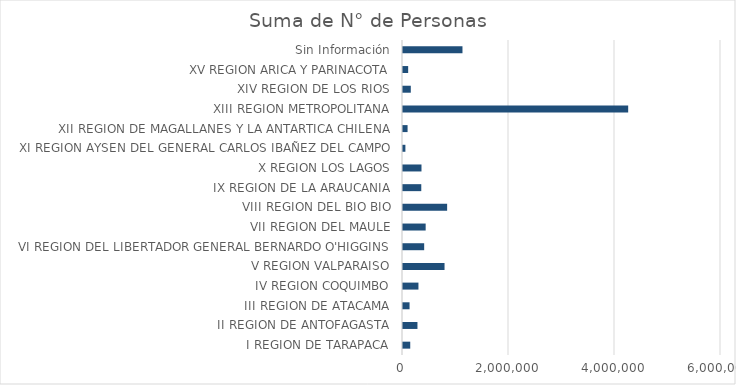
| Category | Series 0 |
|---|---|
|    I REGION DE TARAPACA | 136636 |
|   II REGION DE ANTOFAGASTA | 272727 |
|  III REGION DE ATACAMA | 123749 |
|   IV REGION COQUIMBO | 291397 |
|    V REGION VALPARAISO | 783750 |
|   VI REGION DEL LIBERTADOR GENERAL BERNARDO O'HIGGINS | 399549 |
|  VII REGION DEL MAULE | 427612 |
| VIII REGION DEL BIO BIO | 832625 |
|   IX REGION DE LA ARAUCANIA | 344881 |
|    X REGION LOS LAGOS | 348768 |
|   XI REGION AYSEN DEL GENERAL CARLOS IBAÑEZ DEL CAMPO | 45252 |
|  XII REGION DE MAGALLANES Y LA ANTARTICA CHILENA | 86344 |
| XIII REGION METROPOLITANA | 4248617 |
|  XIV REGION DE LOS RIOS | 147167 |
|   XV REGION ARICA Y PARINACOTA | 97399 |
| Sin Información | 1122163 |